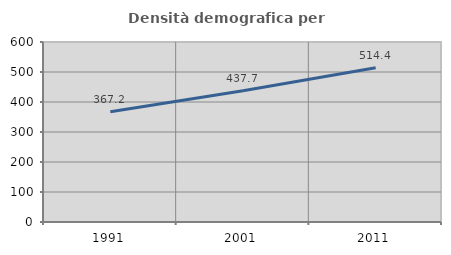
| Category | Densità demografica |
|---|---|
| 1991.0 | 367.242 |
| 2001.0 | 437.654 |
| 2011.0 | 514.435 |